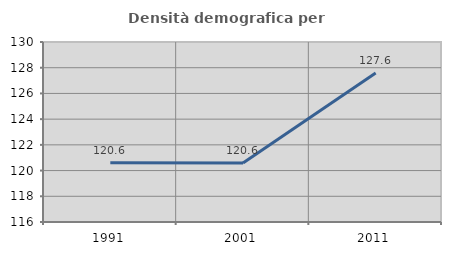
| Category | Densità demografica |
|---|---|
| 1991.0 | 120.612 |
| 2001.0 | 120.583 |
| 2011.0 | 127.588 |